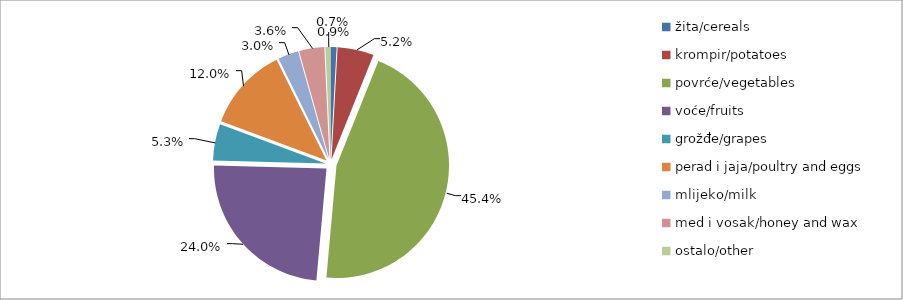
| Category | Series 0 |
|---|---|
| žita/cereals | 17818 |
| krompir/potatoes | 106806 |
| povrće/vegetables | 929509 |
| voće/fruits | 491491 |
| grožđe/grapes | 108106 |
| perad i jaja/poultry and eggs | 245622 |
| mlijeko/milk | 60859.5 |
| med i vosak/honey and wax | 74300 |
| ostalo/other | 14980 |